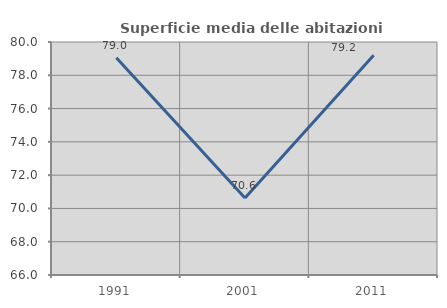
| Category | Superficie media delle abitazioni occupate |
|---|---|
| 1991.0 | 79.05 |
| 2001.0 | 70.629 |
| 2011.0 | 79.198 |